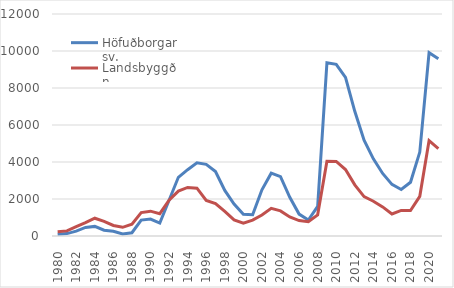
| Category | Höfuðborgarsv. | Landsbyggðin |
|---|---|---|
| 1980.0 | 101.107 | 230.205 |
| 1981.0 | 130.452 | 276.96 |
| 1982.0 | 263.822 | 505.155 |
| 1983.0 | 463.917 | 723 |
| 1984.0 | 519.417 | 961.25 |
| 1985.0 | 310.833 | 793.833 |
| 1986.0 | 253.167 | 569.667 |
| 1987.0 | 113.917 | 470.167 |
| 1988.0 | 176.833 | 642.75 |
| 1989.0 | 858.667 | 1266.5 |
| 1990.0 | 912.75 | 1342.583 |
| 1991.0 | 695.583 | 1204.917 |
| 1992.0 | 1932.75 | 1935.083 |
| 1993.0 | 3173.333 | 2428.083 |
| 1994.0 | 3584.333 | 2624.333 |
| 1995.0 | 3953.667 | 2584.75 |
| 1996.0 | 3871.75 | 1919.25 |
| 1997.0 | 3482.667 | 1747.75 |
| 1998.0 | 2462.5 | 1325.917 |
| 1999.0 | 1729.583 | 872.5 |
| 2000.0 | 1170 | 695 |
| 2001.0 | 1152 | 858 |
| 2002.0 | 2495 | 1135 |
| 2003.0 | 3394 | 1498 |
| 2004.0 | 3207 | 1357 |
| 2005.0 | 2093 | 1026 |
| 2006.0 | 1185 | 832 |
| 2007.0 | 861.917 | 770.333 |
| 2008.0 | 1600.167 | 1144.333 |
| 2009.0 | 9363.417 | 4043.333 |
| 2010.0 | 9281.167 | 4027.5 |
| 2011.0 | 8575.167 | 3592.167 |
| 2012.0 | 6739.333 | 2765.5 |
| 2013.0 | 5176 | 2128 |
| 2014.0 | 4172.833 | 1879.75 |
| 2015.0 | 3381.5 | 1573.583 |
| 2016.0 | 2790.667 | 1188.333 |
| 2017.0 | 2514.667 | 1384.333 |
| 2018.0 | 2904.25 | 1378.25 |
| 2019.0 | 4536.75 | 2143.583 |
| 2020.0 | 9907.5 | 5158.5 |
| 2021.0 | 9585.667 | 4727.417 |